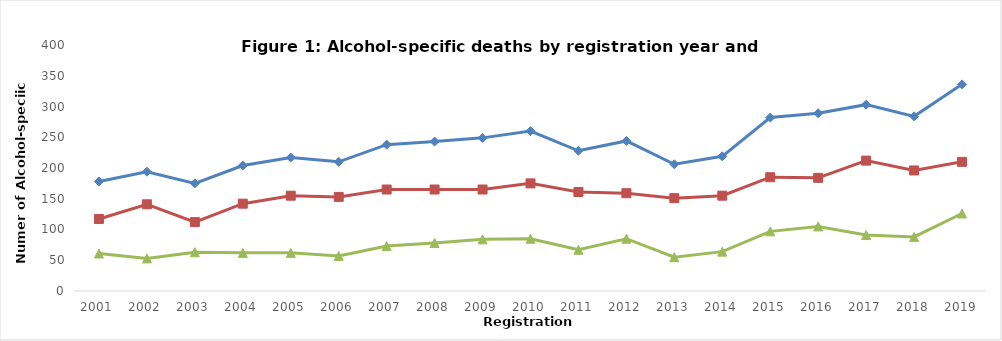
| Category | All | Male | Female |
|---|---|---|---|
| 2001.0 | 178 | 117 | 61 |
| 2002.0 | 194 | 141 | 53 |
| 2003.0 | 175 | 112 | 63 |
| 2004.0 | 204 | 142 | 62 |
| 2005.0 | 217 | 155 | 62 |
| 2006.0 | 210 | 153 | 57 |
| 2007.0 | 238 | 165 | 73 |
| 2008.0 | 243 | 165 | 78 |
| 2009.0 | 249 | 165 | 84 |
| 2010.0 | 260 | 175 | 85 |
| 2011.0 | 228 | 161 | 67 |
| 2012.0 | 244 | 159 | 85 |
| 2013.0 | 206 | 151 | 55 |
| 2014.0 | 219 | 155 | 64 |
| 2015.0 | 282 | 185 | 97 |
| 2016.0 | 289 | 184 | 105 |
| 2017.0 | 303 | 212 | 91 |
| 2018.0 | 284 | 196 | 88 |
| 2019.0 | 336 | 210 | 126 |